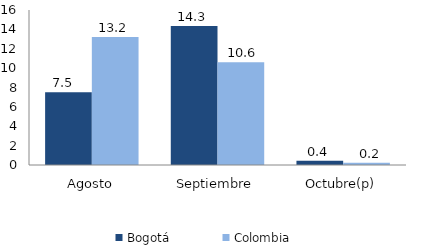
| Category | Bogotá | Colombia |
|---|---|---|
| Agosto | 7.511 | 13.223 |
| Septiembre | 14.347 | 10.599 |
| Octubre(p) | 0.448 | 0.243 |